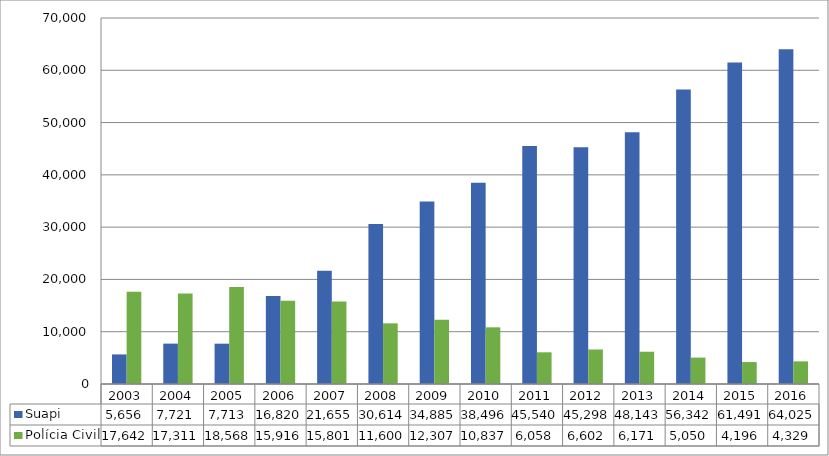
| Category | Suapi | Polícia Civil |
|---|---|---|
| 2003.0 | 5656 | 17642 |
| 2004.0 | 7721 | 17311 |
| 2005.0 | 7713 | 18568 |
| 2006.0 | 16820 | 15916 |
| 2007.0 | 21655 | 15801 |
| 2008.0 | 30614 | 11600 |
| 2009.0 | 34885 | 12307 |
| 2010.0 | 38496 | 10837 |
| 2011.0 | 45540 | 6058 |
| 2012.0 | 45298 | 6602 |
| 2013.0 | 48143 | 6171 |
| 2014.0 | 56342 | 5050 |
| 2015.0 | 61491 | 4196 |
| 2016.0 | 64025 | 4329 |